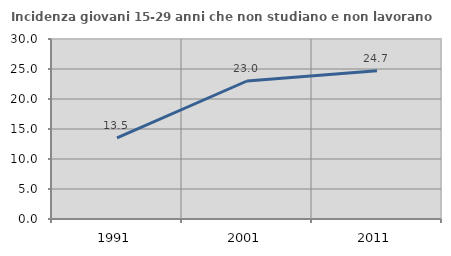
| Category | Incidenza giovani 15-29 anni che non studiano e non lavorano  |
|---|---|
| 1991.0 | 13.536 |
| 2001.0 | 23 |
| 2011.0 | 24.706 |